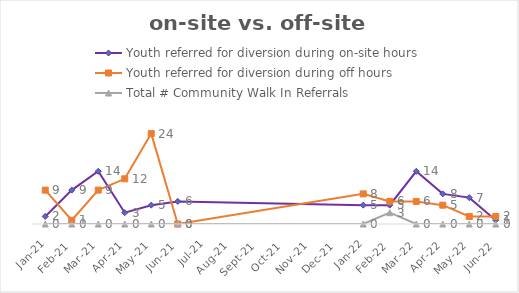
| Category | Youth referred for diversion during on-site hours | Youth referred for diversion during off hours | Total # Community Walk In Referrals |
|---|---|---|---|
| 2021-01-01 | 2 | 9 | 0 |
| 2021-02-01 | 9 | 1 | 0 |
| 2021-03-01 | 14 | 9 | 0 |
| 2021-04-01 | 3 | 12 | 0 |
| 2021-05-01 | 5 | 24 | 0 |
| 2021-06-01 | 6 | 0 | 0 |
| 2022-01-01 | 5 | 8 | 0 |
| 2022-02-01 | 5 | 6 | 3 |
| 2022-03-01 | 14 | 6 | 0 |
| 2022-04-01 | 8 | 5 | 0 |
| 2022-05-01 | 7 | 2 | 0 |
| 2022-06-01 | 1 | 2 | 0 |